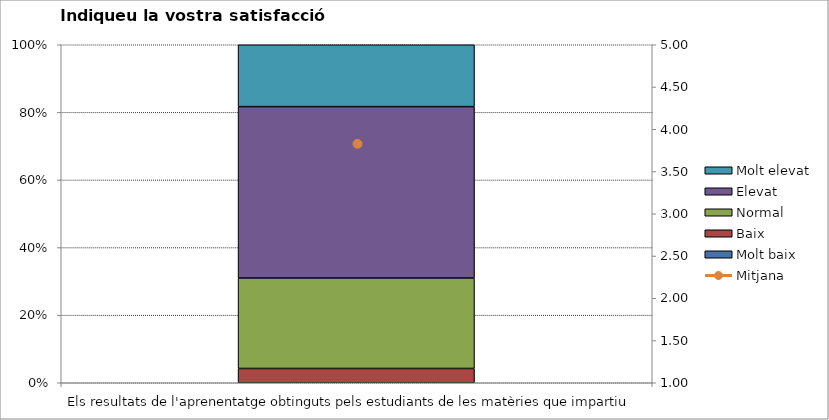
| Category | Molt baix | Baix | Normal  | Elevat | Molt elevat |
|---|---|---|---|---|---|
| Els resultats de l'aprenentatge obtinguts pels estudiants de les matèries que impartiu | 0 | 3 | 19 | 36 | 13 |